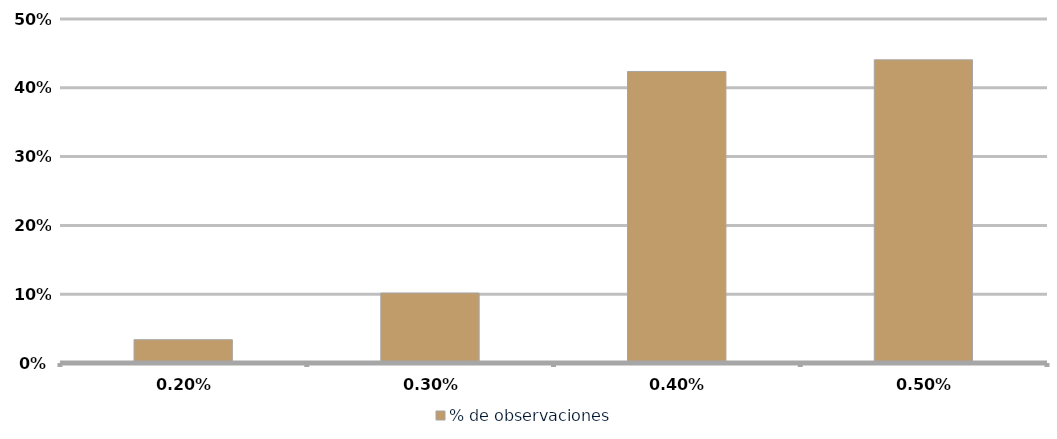
| Category | % de observaciones  |
|---|---|
| 0.002 | 0.034 |
| 0.003 | 0.102 |
| 0.004 | 0.424 |
| 0.005 | 0.441 |